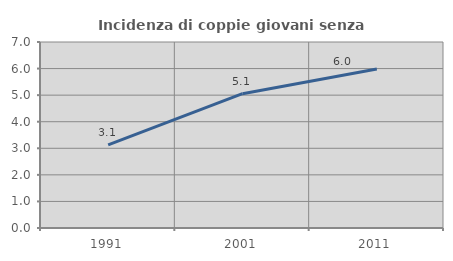
| Category | Incidenza di coppie giovani senza figli |
|---|---|
| 1991.0 | 3.125 |
| 2001.0 | 5.056 |
| 2011.0 | 5.985 |